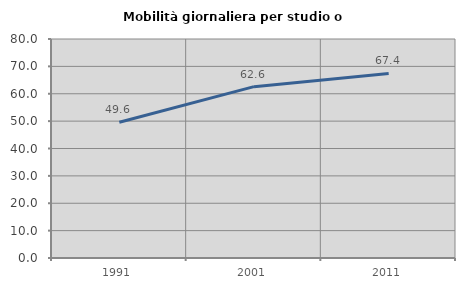
| Category | Mobilità giornaliera per studio o lavoro |
|---|---|
| 1991.0 | 49.611 |
| 2001.0 | 62.594 |
| 2011.0 | 67.406 |